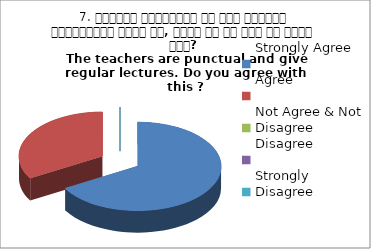
| Category | 7. शिक्षक समयनिष्ट है एवं नियमित व्याख्यान देते है, क्या आप इस बात से सहमत हैं? 
The teachers are punctual and give regular lectures. Do you agree with this ?
 Strongly Agree Agree Strongly Agree |
|---|---|
| Strongly Agree | 2 |
| Agree | 1 |
| Not Agree & Not Disagree | 0 |
| Disagree | 0 |
| Strongly Disagree | 0 |